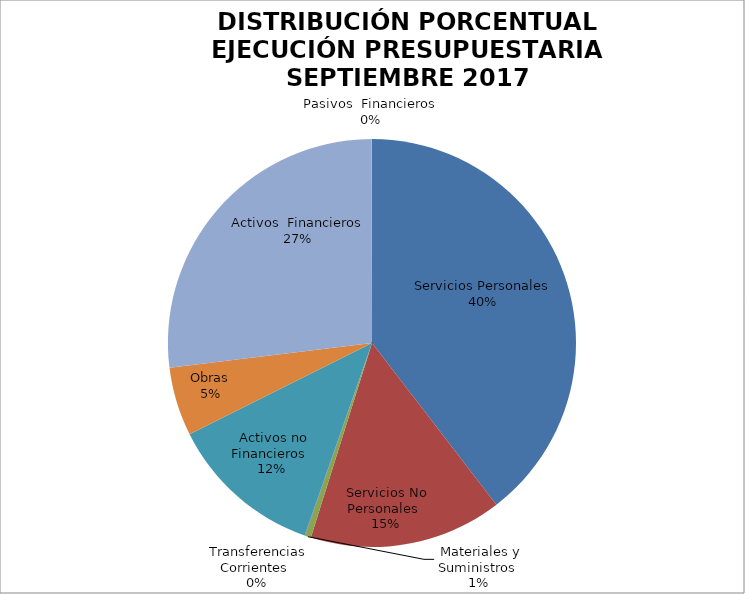
| Category | Series 0 | Series 1 |
|---|---|---|
| Servicios Personales | 21326965.67 | 0.857 |
| Servicios No Personales | 8239240.27 | 0.331 |
| Materiales y Suministros | 253435.63 | 0.01 |
| Transferencias Corrientes | 20000 | 0 |
| Activos no Financieros | 6610744.02 | 0.266 |
| Obras | 2935639.46 | 0.071 |
| Activos  Financieros | -14508215.36 | -0.583 |
| Pasivos  Financieros | 12800 | 0.001 |